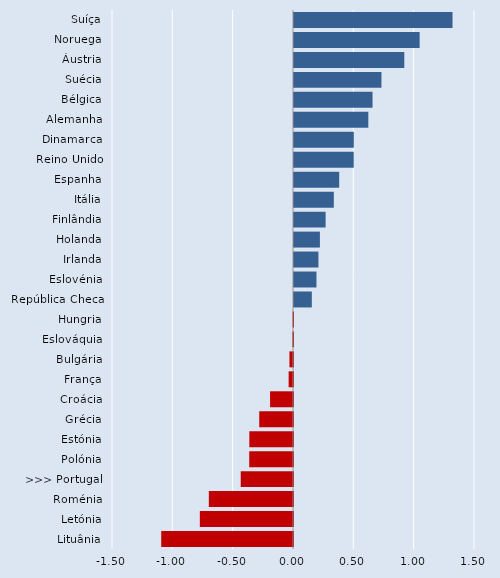
| Category | Series 0 |
|---|---|
| Suíça | 1.314 |
| Noruega | 1.041 |
| Áustria | 0.914 |
| Suécia | 0.725 |
| Bélgica | 0.651 |
| Alemanha | 0.616 |
| Dinamarca | 0.496 |
| Reino Unido | 0.495 |
| Espanha | 0.375 |
| Itália | 0.33 |
| Finlândia | 0.262 |
| Holanda | 0.215 |
| Irlanda | 0.203 |
| Eslovénia | 0.186 |
| República Checa | 0.148 |
| Hungria | -0.003 |
| Eslováquia | -0.005 |
| Bulgária | -0.029 |
| França | -0.036 |
| Croácia | -0.19 |
| Grécia | -0.28 |
| Estónia | -0.362 |
| Polónia | -0.363 |
| >>> Portugal | -0.433 |
| Roménia | -0.698 |
| Letónia | -0.772 |
| Lituânia | -1.092 |